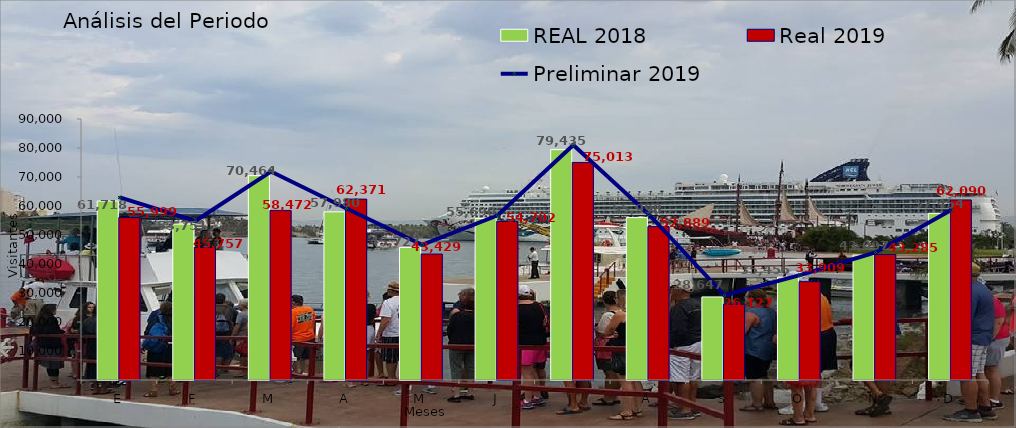
| Category | REAL 2018 | Real 2019 |
|---|---|---|
| E | 61718 | 55999 |
| F | 53751 | 45757 |
| M | 70464 | 58472 |
| A | 57980 | 62371 |
| M | 45727 | 43429 |
| J | 55690 | 54702 |
| J | 79435 | 75013 |
| A | 55998 | 52889 |
| S | 28647 | 26127 |
| O | 35455 | 33909 |
| N | 43097 | 43285 |
| D | 57454 | 62090 |